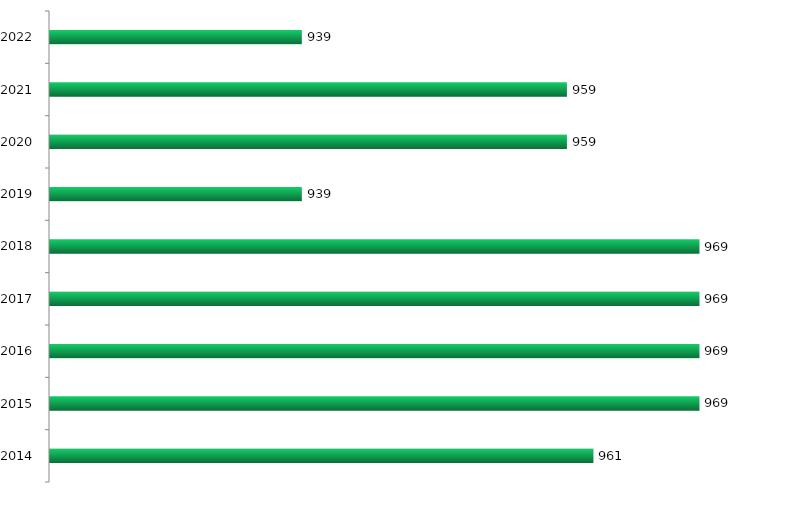
| Category | Vagas ofertadas |
|---|---|
| 2014.0 | 961 |
| 2015.0 | 969 |
| 2016.0 | 969 |
| 2017.0 | 969 |
| 2018.0 | 969 |
| 2019.0 | 939 |
| 2020.0 | 959 |
| 2021.0 | 959 |
| 2022.0 | 939 |